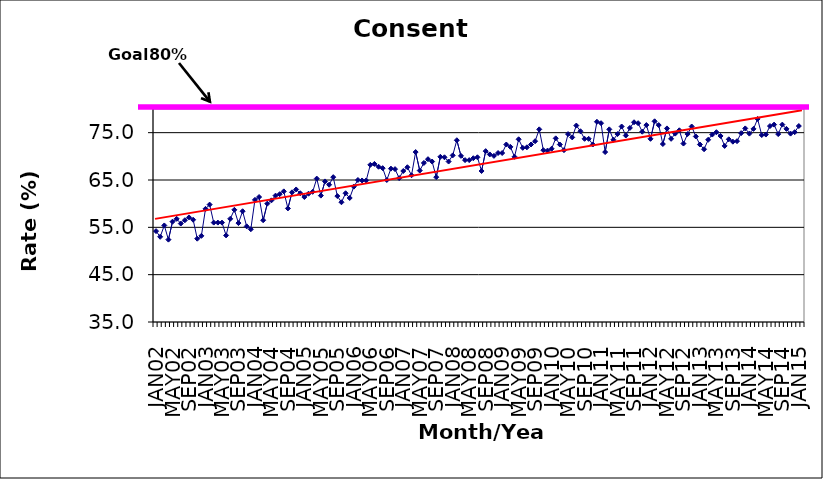
| Category | Series 0 |
|---|---|
| JAN02 | 54.2 |
| FEB02 | 53 |
| MAR02 | 55.4 |
| APR02 | 52.4 |
| MAY02 | 56.2 |
| JUN02 | 56.8 |
| JUL02 | 55.8 |
| AUG02 | 56.5 |
| SEP02 | 57.1 |
| OCT02 | 56.6 |
| NOV02 | 52.6 |
| DEC02 | 53.2 |
| JAN03 | 58.9 |
| FEB03 | 59.8 |
| MAR03 | 56 |
| APR03 | 56 |
| MAY03 | 56 |
| JUN03 | 53.3 |
| JUL03 | 56.8 |
| AUG03 | 58.7 |
| SEP03 | 55.9 |
| OCT03 | 58.4 |
| NOV03 | 55.2 |
| DEC03 | 54.6 |
| JAN04 | 60.8 |
| FEB04 | 61.4 |
| MAR04 | 56.5 |
| APR04 | 60 |
| MAY04 | 60.7 |
| JUN04 | 61.7 |
| JUL04 | 62 |
| AUG04 | 62.6 |
| SEP04 | 59 |
| OCT04 | 62.4 |
| NOV04 | 63 |
| DEC04 | 62.2 |
| JAN05 | 61.4 |
| FEB05 | 62.1 |
| MAR05 | 62.5 |
| APR05 | 65.3 |
| MAY05 | 61.7 |
| JUN05 | 64.7 |
| JUL05 | 64 |
| AUG05 | 65.6 |
| SEP05 | 61.6 |
| OCT05 | 60.3 |
| NOV05 | 62.2 |
| DEC05 | 61.2 |
| JAN06 | 63.6 |
| FEB06 | 65 |
| MAR06 | 64.9 |
| APR06 | 64.9 |
| MAY06 | 68.2 |
| JUN06 | 68.4 |
| JUL06 | 67.8 |
| AUG06 | 67.5 |
| SEP06 | 65 |
| OCT06 | 67.4 |
| NOV06 | 67.3 |
| DEC06 | 65.4 |
| JAN07 | 66.9 |
| FEB07 | 67.7 |
| MAR07 | 66 |
| APR07 | 70.9 |
| MAY07 | 67 |
| JUN07 | 68.6 |
| JUL07 | 69.4 |
| AUG07 | 68.9 |
| SEP07 | 65.6 |
| OCT07 | 69.9 |
| NOV07 | 69.8 |
| DEC07 | 68.9 |
| JAN08 | 70.2 |
| FEB08 | 73.4 |
| MAR08 | 70.1 |
| APR08 | 69.2 |
| MAY08 | 69.2 |
| JUN08 | 69.6 |
| JUL08 | 69.8 |
| AUG08 | 66.9 |
| SEP08 | 71.1 |
| OCT08 | 70.4 |
| NOV08 | 70.1 |
| DEC08 | 70.7 |
| JAN09 | 70.7 |
| FEB09 | 72.5 |
| MAR09 | 72 |
| APR09 | 69.9 |
| MAY09 | 73.6 |
| JUN09 | 71.8 |
| JUL09 | 71.9 |
| AUG09 | 72.5 |
| SEP09 | 73.2 |
| OCT09 | 75.7 |
| NOV09 | 71.3 |
| DEC09 | 71.2 |
| JAN10 | 71.6 |
| FEB10 | 73.8 |
| MAR10 | 72.5 |
| APR10 | 71.3 |
| MAY10 | 74.7 |
| JUN10 | 74 |
| JUL10 | 76.5 |
| AUG10 | 75.3 |
| SEP10 | 73.7 |
| OCT10 | 73.7 |
| NOV10 | 72.5 |
| DEC10 | 77.3 |
| JAN11 | 77 |
| FEB11 | 70.9 |
| MAR11 | 75.7 |
| APR11 | 73.5 |
| MAY11 | 74.7 |
| JUN11 | 76.3 |
| JUL11 | 74.4 |
| AUG11 | 76 |
| SEP11 | 77.2 |
| OCT11 | 77 |
| NOV11 | 75.2 |
| DEC11 | 76.6 |
| JAN12 | 73.7 |
| FEB12 | 77.4 |
| MAR12 | 76.6 |
| APR12 | 72.6 |
| MAY12 | 75.9 |
| JUN12 | 73.7 |
| JUL12 | 74.8 |
| AUG12 | 75.5 |
| SEP12 | 72.7 |
| OCT12 | 74.7 |
| NOV12 | 76.3 |
| DEC12 | 74.2 |
| JAN13 | 72.5 |
| FEB13 | 71.5 |
| MAR13 | 73.5 |
| APR13 | 74.6 |
| MAY13 | 75.1 |
| JUN13 | 74.3 |
| JUL13 | 72.2 |
| AUG13 | 73.6 |
| SEP13 | 73.1 |
| OCT13 | 73.2 |
| NOV13 | 74.9 |
| DEC13 | 75.9 |
| JAN14 | 74.8 |
| FEB14 | 75.8 |
| MAR14 | 77.9 |
| APR14 | 74.5 |
| MAY14 | 74.6 |
| JUN14 | 76.4 |
| JUL14 | 76.7 |
| AUG14 | 74.7 |
| SEP14 | 76.7 |
| OCT14 | 75.8 |
| NOV14 | 74.8 |
| DEC14 | 75.1 |
| JAN15 | 76.4 |